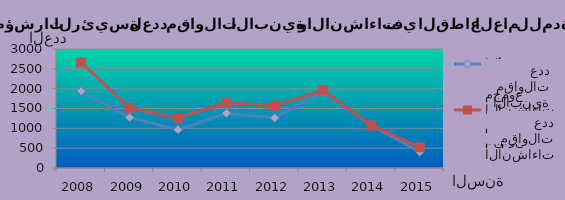
| Category | مجموع مقاولات الأبنية | مجموع مقاولات الإنشاءات |
|---|---|---|
| 2008.0 | 1937 | 2659 |
| 2009.0 | 1273 | 1513 |
| 2010.0 | 967 | 1255 |
| 2011.0 | 1380 | 1644 |
| 2012.0 | 1265 | 1570 |
| 2013.0 | 1919 | 1959 |
| 2014.0 | 1073 | 1073 |
| 2015.0 | 406 | 523 |